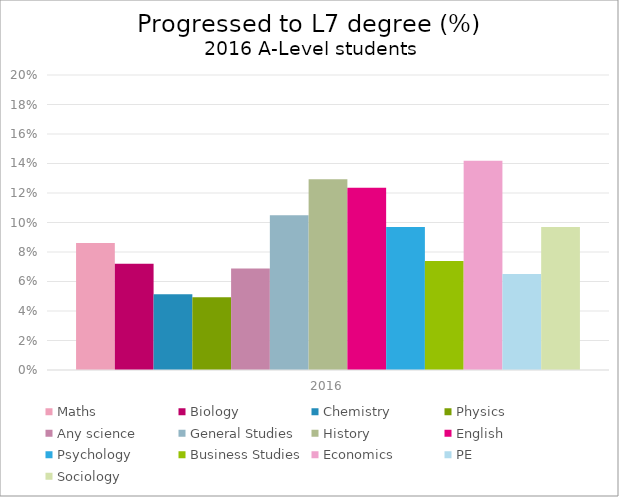
| Category | Maths | Biology | Chemistry | Physics | Any science | General Studies | History | English | Psychology | Business Studies | Economics | PE | Sociology |
|---|---|---|---|---|---|---|---|---|---|---|---|---|---|
| 2016.0 | 0.086 | 0.072 | 0.051 | 0.049 | 0.069 | 0.105 | 0.129 | 0.124 | 0.097 | 0.074 | 0.142 | 0.065 | 0.097 |